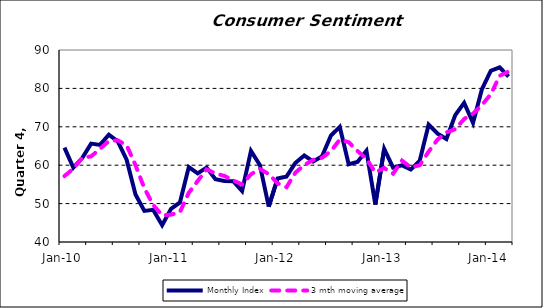
| Category | Monthly Index | 3 mth moving average |
|---|---|---|
| 2010-01-01 | 64.578 | 57.163 |
| 2010-02-01 | 59.383 | 59.098 |
| 2010-03-01 | 61.862 | 61.941 |
| 2010-04-01 | 65.63 | 62.292 |
| 2010-05-01 | 65.286 | 64.259 |
| 2010-06-01 | 67.938 | 66.285 |
| 2010-07-01 | 66.214 | 66.48 |
| 2010-08-01 | 61.426 | 65.193 |
| 2010-09-01 | 52.375 | 60.005 |
| 2010-10-01 | 48.094 | 53.965 |
| 2010-11-01 | 48.365 | 49.611 |
| 2010-12-01 | 44.373 | 46.944 |
| 2011-01-01 | 48.656 | 47.131 |
| 2011-02-01 | 50.295 | 47.775 |
| 2011-03-01 | 59.528 | 52.826 |
| 2011-04-01 | 57.858 | 55.894 |
| 2011-05-01 | 59.365 | 58.917 |
| 2011-06-01 | 56.35 | 57.857 |
| 2011-07-01 | 55.901 | 57.205 |
| 2011-08-01 | 55.829 | 56.027 |
| 2011-09-01 | 53.277 | 55.003 |
| 2011-10-01 | 63.743 | 57.616 |
| 2011-11-01 | 60.076 | 59.032 |
| 2011-12-01 | 49.206 | 57.675 |
| 2012-01-01 | 56.554 | 55.279 |
| 2012-02-01 | 57.034 | 54.265 |
| 2012-03-01 | 60.596 | 58.061 |
| 2012-04-01 | 62.531 | 60.054 |
| 2012-05-01 | 60.96 | 61.362 |
| 2012-06-01 | 62.311 | 61.934 |
| 2012-07-01 | 67.722 | 63.664 |
| 2012-08-01 | 69.97 | 66.668 |
| 2012-09-01 | 60.237 | 65.976 |
| 2012-10-01 | 60.866 | 63.691 |
| 2012-11-01 | 63.757 | 61.62 |
| 2012-12-01 | 49.754 | 58.126 |
| 2013-01-01 | 64.249 | 59.253 |
| 2013-02-01 | 59.369 | 57.791 |
| 2013-03-01 | 59.969 | 61.196 |
| 2013-04-01 | 58.875 | 59.404 |
| 2013-05-01 | 61.196 | 60.013 |
| 2013-06-01 | 70.565 | 63.545 |
| 2013-07-01 | 68.236 | 66.666 |
| 2013-08-01 | 66.818 | 68.539 |
| 2013-09-01 | 73.054 | 69.369 |
| 2013-10-01 | 76.227 | 72.033 |
| 2013-11-01 | 71.023 | 73.435 |
| 2013-12-01 | 79.777 | 75.675 |
| 2014-01-01 | 84.58 | 78.46 |
| 2014-02-01 | 85.481 | 83.279 |
| 2014-03-01 | 83.062 | 84.374 |